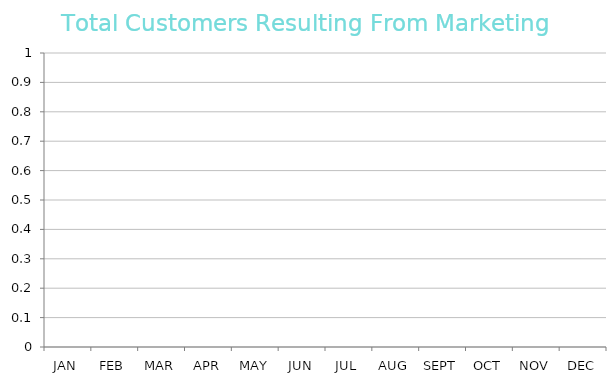
| Category | Total |
|---|---|
| JAN | 0 |
| FEB | 0 |
| MAR | 0 |
| APR | 0 |
| MAY | 0 |
| JUN | 0 |
| JUL | 0 |
| AUG | 0 |
| SEPT | 0 |
| OCT | 0 |
| NOV | 0 |
| DEC | 0 |